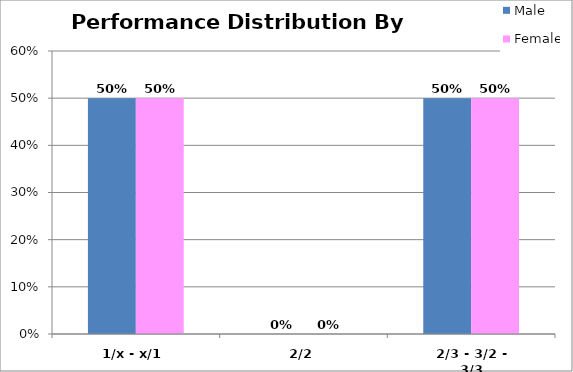
| Category | Male | Female |
|---|---|---|
| 1/x - x/1 | 0.5 | 0.5 |
| 2/2 | 0 | 0 |
| 2/3 - 3/2 - 3/3 | 0.5 | 0.5 |